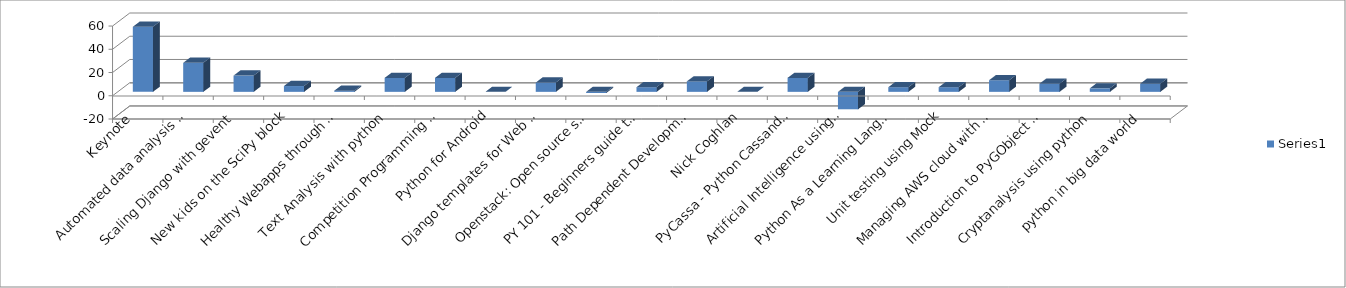
| Category | Series 0 |
|---|---|
| Keynote  | 56 |
| Automated data analysis with Python  | 25 |
| Scaling Django with gevent | 14 |
| New kids on the SciPy block | 5 |
| Healthy Webapps through Continuous Introspection | 1 |
| Text Analysis with python | 12 |
| Competition Programming and Problem Solving using Python | 12 |
| Python for Android | 0 |
| Django templates for Web Designers | 8 |
| Openstack: Open source software for building private and public clouds written in Python. | -1 |
| PY 101 - Beginners guide to create a python package | 4 |
| Path Dependent Development | 9 |
| Nick Coghlan | 0 |
| PyCassa - Python Cassandrified | 12 |
| Artificial Intelligence using Python | -15 |
| Python As a Learning Language (An undergraduate student’s view) | 4 |
| Unit testing using Mock | 4 |
| Managing AWS cloud with python | 10 |
| Introduction to PyGObject - Gtk, GStreamer & other Gnome API | 7 |
| Cryptanalysis using python | 3 |
| python in big data world | 7 |